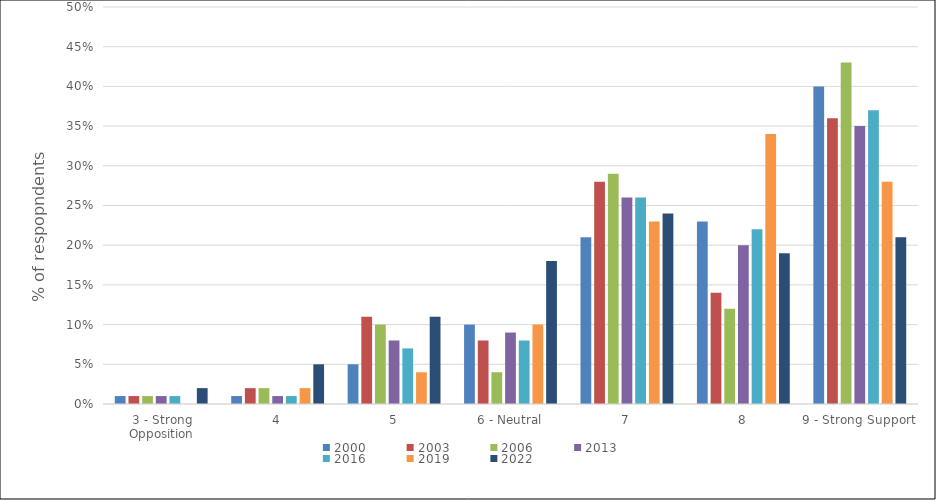
| Category | 2000 | 2003 | 2006 | 2013 | 2016 | 2019 | 2022 |
|---|---|---|---|---|---|---|---|
| 3 - Strong Opposition | 0.01 | 0.01 | 0.01 | 0.01 | 0.01 | 0 | 0.02 |
| 4 | 0.01 | 0.02 | 0.02 | 0.01 | 0.01 | 0.02 | 0.05 |
| 5 | 0.05 | 0.11 | 0.1 | 0.08 | 0.07 | 0.04 | 0.11 |
| 6 - Neutral | 0.1 | 0.08 | 0.04 | 0.09 | 0.08 | 0.1 | 0.18 |
| 7 | 0.21 | 0.28 | 0.29 | 0.26 | 0.26 | 0.23 | 0.24 |
| 8 | 0.23 | 0.14 | 0.12 | 0.2 | 0.22 | 0.34 | 0.19 |
| 9 - Strong Support | 0.4 | 0.36 | 0.43 | 0.35 | 0.37 | 0.28 | 0.21 |